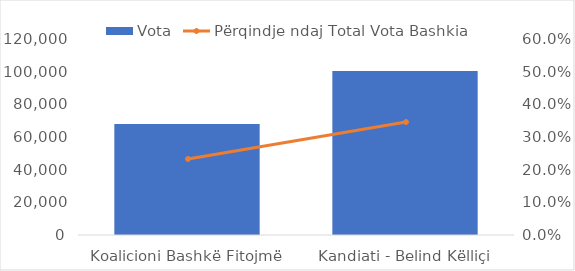
| Category | Vota |
|---|---|
| Koalicioni Bashkë Fitojmë | 67999 |
| Kandiati - Belind Këlliçi | 100422 |